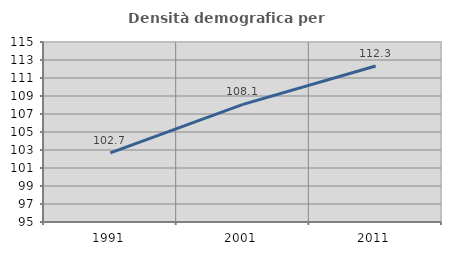
| Category | Densità demografica |
|---|---|
| 1991.0 | 102.688 |
| 2001.0 | 108.066 |
| 2011.0 | 112.338 |